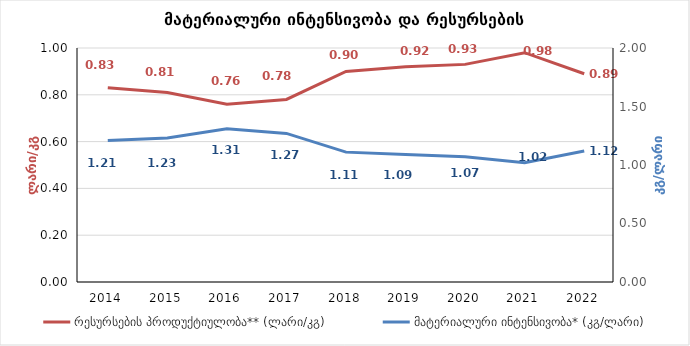
| Category | რესურსების პროდუქტიულობა** (ლარი/კგ) |
|---|---|
| 2014.0 | 0.83 |
| 2015.0 | 0.81 |
| 2016.0 | 0.76 |
| 2017.0 | 0.78 |
| 2018.0 | 0.9 |
| 2019.0 | 0.92 |
| 2020.0 | 0.93 |
| 2021.0 | 0.98 |
| 2022.0 | 0.89 |